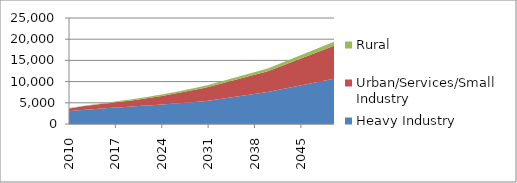
| Category | Heavy Industry | Urban/Services/Small Industry | Rural |
|---|---|---|---|
| 2010.0 | 3006.4 | 676.44 | 75.16 |
| 2011.0 | 3156.84 | 751.248 | 87.912 |
| 2012.0 | 3329.82 | 836.724 | 102.456 |
| 2013.0 | 3437.28 | 910.656 | 116.064 |
| 2014.0 | 3555.28 | 991.736 | 130.984 |
| 2015.0 | 3673.5 | 1077.56 | 146.94 |
| 2016.0 | 3762.16 | 1148.984 | 172.856 |
| 2017.0 | 3870.46 | 1230.064 | 201.476 |
| 2018.0 | 3970.8 | 1312.57 | 231.63 |
| 2019.0 | 4072.56 | 1399.584 | 263.856 |
| 2020.0 | 4176.2 | 1491.5 | 298.3 |
| 2021.0 | 4281.45 | 1613.3 | 310.25 |
| 2022.0 | 4388.72 | 1742.58 | 322.7 |
| 2023.0 | 4497.71 | 1879.64 | 335.65 |
| 2024.0 | 4608.12 | 2024.78 | 349.1 |
| 2025.0 | 4720.3 | 2178.6 | 363.1 |
| 2026.0 | 4834.066 | 2341.501 | 377.661 |
| 2027.0 | 4949.045 | 2513.801 | 392.781 |
| 2028.0 | 5066.285 | 2696.571 | 408.571 |
| 2029.0 | 5184.502 | 2889.722 | 424.959 |
| 2030.0 | 5304.221 | 3094.129 | 442.018 |
| 2031.0 | 5492.202 | 3240.169 | 459.598 |
| 2040.0 | 7533.943 | 4913.441 | 655.125 |
| 2050.0 | 10681.005 | 7768.003 | 971 |